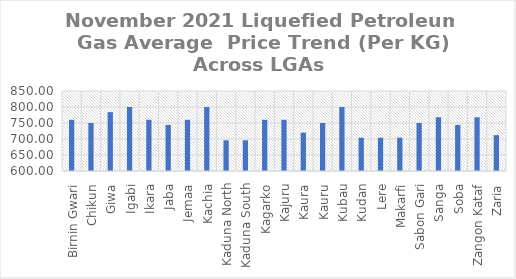
| Category | Nov-21 |
|---|---|
| Birnin Gwari | 760 |
| Chikun | 750 |
| Giwa | 784 |
| Igabi | 800 |
| Ikara | 760 |
| Jaba | 744 |
| Jemaa | 760 |
| Kachia | 800 |
| Kaduna North | 696 |
| Kaduna South | 696 |
| Kagarko | 760 |
| Kajuru | 760 |
| Kaura | 720 |
| Kauru | 750 |
| Kubau | 800 |
| Kudan | 704 |
| Lere | 704 |
| Makarfi | 704 |
| Sabon Gari | 750 |
| Sanga | 768 |
| Soba | 744 |
| Zangon Kataf | 768 |
| Zaria | 712 |